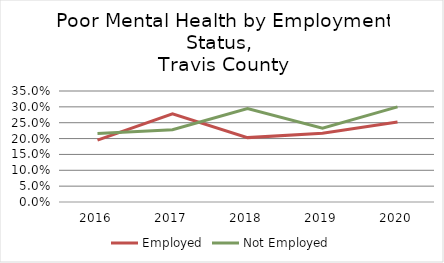
| Category | Employed | Not Employed |
|---|---|---|
| 2016.0 | 0.195 | 0.216 |
| 2017.0 | 0.278 | 0.228 |
| 2018.0 | 0.203 | 0.295 |
| 2019.0 | 0.217 | 0.233 |
| 2020.0 | 0.252 | 0.3 |